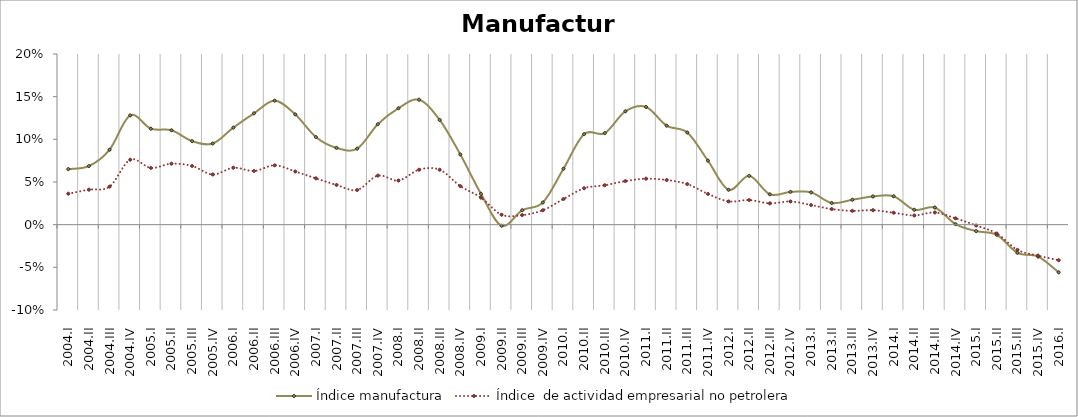
| Category | Índice manufactura | Índice  de actividad empresarial no petrolera |
|---|---|---|
| 2004.I | 0.065 | 0.036 |
| 2004.II | 0.069 | 0.041 |
| 2004.III | 0.088 | 0.045 |
| 2004.IV | 0.128 | 0.076 |
| 2005.I | 0.112 | 0.066 |
| 2005.II | 0.111 | 0.071 |
| 2005.III | 0.098 | 0.069 |
| 2005.IV | 0.095 | 0.059 |
| 2006.I | 0.114 | 0.067 |
| 2006.II | 0.13 | 0.063 |
| 2006.III | 0.145 | 0.07 |
| 2006.IV | 0.129 | 0.062 |
| 2007.I | 0.103 | 0.054 |
| 2007.II | 0.09 | 0.047 |
| 2007.III | 0.089 | 0.041 |
| 2007.IV | 0.118 | 0.057 |
| 2008.I | 0.136 | 0.052 |
| 2008.II | 0.146 | 0.064 |
| 2008.III | 0.123 | 0.064 |
| 2008.IV | 0.082 | 0.045 |
| 2009.I | 0.036 | 0.032 |
| 2009.II | -0.001 | 0.012 |
| 2009.III | 0.017 | 0.011 |
| 2009.IV | 0.026 | 0.017 |
| 2010.I | 0.066 | 0.03 |
| 2010.II | 0.106 | 0.043 |
| 2010.III | 0.107 | 0.046 |
| 2010.IV | 0.133 | 0.051 |
| 2011.I | 0.138 | 0.054 |
| 2011.II | 0.116 | 0.052 |
| 2011.III | 0.108 | 0.048 |
| 2011.IV | 0.075 | 0.036 |
| 2012.I | 0.041 | 0.027 |
| 2012.II | 0.057 | 0.029 |
| 2012.III | 0.036 | 0.025 |
| 2012.IV | 0.038 | 0.027 |
| 2013.I | 0.038 | 0.023 |
| 2013.II | 0.025 | 0.018 |
| 2013.III | 0.029 | 0.016 |
| 2013.IV | 0.033 | 0.017 |
| 2014.I | 0.033 | 0.014 |
| 2014.II | 0.017 | 0.011 |
| 2014.III | 0.02 | 0.014 |
| 2014.IV | 0.001 | 0.007 |
| 2015.I | -0.008 | -0.001 |
| 2015.II | -0.012 | -0.01 |
| 2015.III | -0.033 | -0.03 |
| 2015.IV | -0.037 | -0.036 |
| 2016.I | -0.056 | -0.042 |